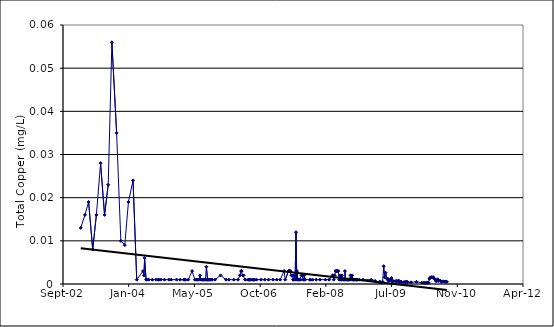
| Category | Series 0 |
|---|---|
| 37635.0 | 0.013 |
| 37667.0 | 0.016 |
| 37695.0 | 0.019 |
| 37726.0 | 0.008 |
| 37754.0 | 0.016 |
| 37786.0 | 0.028 |
| 37816.0 | 0.016 |
| 37844.0 | 0.023 |
| 37872.0 | 0.056 |
| 37908.0 | 0.035 |
| 37940.0 | 0.01 |
| 37970.0 | 0.009 |
| 37998.0 | 0.019 |
| 38033.0 | 0.024 |
| 38061.0 | 0.001 |
| 38109.0 | 0.003 |
| 38116.0 | 0.002 |
| 38121.0 | 0.006 |
| 38132.0 | 0.001 |
| 38139.0 | 0.001 |
| 38152.0 | 0.001 |
| 38180.0 | 0.001 |
| 38208.0 | 0.001 |
| 38223.0 | 0.001 |
| 38230.0 | 0.001 |
| 38244.0 | 0.001 |
| 38272.0 | 0.001 |
| 38306.0 | 0.001 |
| 38324.0 | 0.001 |
| 38364.0 | 0.001 |
| 38391.0 | 0.001 |
| 38419.0 | 0.001 |
| 38425.0 | 0.001 |
| 38433.0 | 0.001 |
| 38453.0 | 0.001 |
| 38482.0 | 0.003 |
| 38503.0 | 0.001 |
| 38514.0 | 0.001 |
| 38522.0 | 0.001 |
| 38524.0 | 0.001 |
| 38535.0 | 0.001 |
| 38543.0 | 0.002 |
| 38550.0 | 0.001 |
| 38558.0 | 0.001 |
| 38564.0 | 0.001 |
| 38570.0 | 0.001 |
| 38577.0 | 0.001 |
| 38584.0 | 0.001 |
| 38587.0 | 0.001 |
| 38591.0 | 0.004 |
| 38600.0 | 0.001 |
| 38601.0 | 0.001 |
| 38606.0 | 0.001 |
| 38613.0 | 0.001 |
| 38619.0 | 0.001 |
| 38626.0 | 0.001 |
| 38635.0 | 0.001 |
| 38657.0 | 0.001 |
| 38699.0 | 0.002 |
| 38740.0 | 0.001 |
| 38762.0 | 0.001 |
| 38800.0 | 0.001 |
| 38832.0 | 0.001 |
| 38846.0 | 0.002 |
| 38855.0 | 0.003 |
| 38860.0 | 0.003 |
| 38867.0 | 0.002 |
| 38874.0 | 0.002 |
| 38887.0 | 0.001 |
| 38888.0 | 0.001 |
| 38909.0 | 0.001 |
| 38915.0 | 0.001 |
| 38916.0 | 0.001 |
| 38923.0 | 0.001 |
| 38930.0 | 0.001 |
| 38944.0 | 0.001 |
| 38950.0 | 0.001 |
| 38951.0 | 0.001 |
| 38958.0 | 0.001 |
| 38972.0 | 0.001 |
| 39007.0 | 0.001 |
| 39035.0 | 0.001 |
| 39064.0 | 0.001 |
| 39098.0 | 0.001 |
| 39126.0 | 0.001 |
| 39153.0 | 0.001 |
| 39182.0 | 0.003 |
| 39191.0 | 0.001 |
| 39216.0 | 0.003 |
| 39217.0 | 0.003 |
| 39224.0 | 0.003 |
| 39231.0 | 0.003 |
| 39238.0 | 0.002 |
| 39245.0 | 0.002 |
| 39251.0 | 0.001 |
| 39252.0 | 0.001 |
| 39259.0 | 0.002 |
| 39266.0 | 0.001 |
| 39273.0 | 0.012 |
| 39279.0 | 0.001 |
| 39280.0 | 0.003 |
| 39287.0 | 0.001 |
| 39294.0 | 0.001 |
| 39301.0 | 0.001 |
| 39308.0 | 0.001 |
| 39315.0 | 0.002 |
| 39322.0 | 0.002 |
| 39329.0 | 0.001 |
| 39335.0 | 0.001 |
| 39336.0 | 0.002 |
| 39342.0 | 0.001 |
| 39378.0 | 0.001 |
| 39384.0 | 0.001 |
| 39399.0 | 0.001 |
| 39426.0 | 0.001 |
| 39455.0 | 0.001 |
| 39497.0 | 0.001 |
| 39525.0 | 0.001 |
| 39552.0 | 0.002 |
| 39553.0 | 0.002 |
| 39560.0 | 0.001 |
| 39567.0 | 0.002 |
| 39574.0 | 0.003 |
| 39581.0 | 0.003 |
| 39583.0 | 0.003 |
| 39588.0 | 0.003 |
| 39595.0 | 0.003 |
| 39602.0 | 0.001 |
| 39609.0 | 0.002 |
| 39615.0 | 0.001 |
| 39616.0 | 0.001 |
| 39623.0 | 0.002 |
| 39630.0 | 0.001 |
| 39637.0 | 0.001 |
| 39643.0 | 0.001 |
| 39645.0 | 0.003 |
| 39651.0 | 0.001 |
| 39660.0 | 0.001 |
| 39665.0 | 0.001 |
| 39671.0 | 0.001 |
| 39672.0 | 0.001 |
| 39679.0 | 0.001 |
| 39688.0 | 0.002 |
| 39693.0 | 0.001 |
| 39700.0 | 0.002 |
| 39706.0 | 0.001 |
| 39707.0 | 0.001 |
| 39714.0 | 0.001 |
| 39721.0 | 0.001 |
| 39728.0 | 0.001 |
| 39735.0 | 0.001 |
| 39736.0 | 0.001 |
| 39742.0 | 0.001 |
| 39755.0 | 0.001 |
| 39783.0 | 0.001 |
| 39846.0 | 0.001 |
| 39875.0 | 0.001 |
| 39905.0 | 0 |
| 39911.0 | 0 |
| 39919.0 | 0 |
| 39926.0 | 0 |
| 39932.0 | 0 |
| 39940.0 | 0.004 |
| 39947.0 | 0.002 |
| 39954.0 | 0.003 |
| 39964.0 | 0.001 |
| 39971.0 | 0.001 |
| 39972.0 | 0.001 |
| 39978.0 | 0.001 |
| 39985.0 | 0.001 |
| 39992.0 | 0.001 |
| 39999.0 | 0.001 |
| 40006.0 | 0.001 |
| 40007.0 | 0.001 |
| 40013.0 | 0.001 |
| 40027.0 | 0.001 |
| 40034.0 | 0.001 |
| 40040.0 | 0.001 |
| 40048.0 | 0.001 |
| 40055.0 | 0.001 |
| 40059.0 | 0.001 |
| 40062.0 | 0 |
| 40069.0 | 0 |
| 40076.0 | 0 |
| 40093.0 | 0 |
| 40103.0 | 0 |
| 40111.0 | 0.001 |
| 40118.0 | 0 |
| 40121.0 | 0 |
| 40148.0 | 0 |
| 40189.0 | 0 |
| 40231.0 | 0 |
| 40247.0 | 0 |
| 40259.0 | 0 |
| 40267.0 | 0 |
| 40274.0 | 0 |
| 40281.0 | 0 |
| 40288.0 | 0.001 |
| 40295.0 | 0.002 |
| 40302.0 | 0.002 |
| 40309.0 | 0.002 |
| 40316.0 | 0.002 |
| 40323.0 | 0.001 |
| 40330.0 | 0.001 |
| 40337.0 | 0.001 |
| 40344.0 | 0.001 |
| 40351.0 | 0.001 |
| 40358.0 | 0.001 |
| 40365.0 | 0.001 |
| 40372.0 | 0.001 |
| 40379.0 | 0 |
| 40386.0 | 0.001 |
| 40393.0 | 0.001 |
| 40400.0 | 0.001 |
| 40407.0 | 0 |
| 40414.0 | 0.001 |
| 40421.0 | 0 |